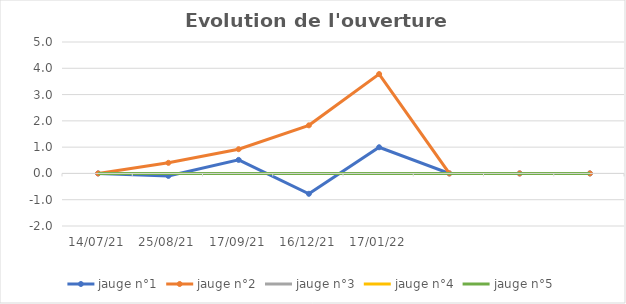
| Category | jauge n°1 | jauge n°2 | jauge n°3 | jauge n°4 | jauge n°5 |
|---|---|---|---|---|---|
| 14/07/21 | 0 | 0 | 0 | 0 | 0 |
| 25/08/21 | -0.095 | 0.403 | 0 | 0 | 0 |
| 17/09/21 | 0.515 | 0.922 | 0 | 0 | 0 |
| 16/12/21 | -0.775 | 1.83 | 0 | 0 | 0 |
| 17/01/22 | 0.996 | 3.781 | 0 | 0 | 0 |